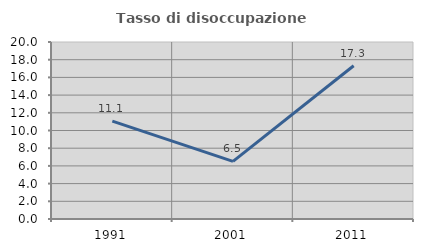
| Category | Tasso di disoccupazione giovanile  |
|---|---|
| 1991.0 | 11.062 |
| 2001.0 | 6.517 |
| 2011.0 | 17.317 |